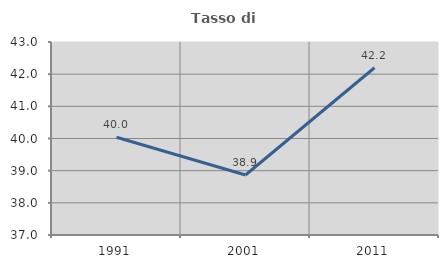
| Category | Tasso di occupazione   |
|---|---|
| 1991.0 | 40.041 |
| 2001.0 | 38.866 |
| 2011.0 | 42.199 |